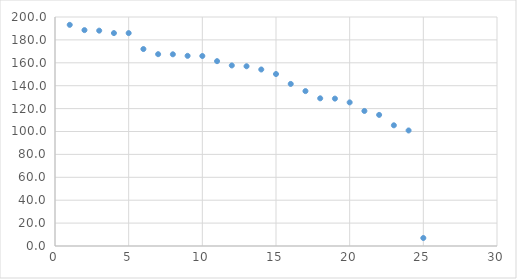
| Category | Series 0 |
|---|---|
| 1.0 | 193.147 |
| 2.0 | 188.543 |
| 3.0 | 188.076 |
| 4.0 | 185.95 |
| 5.0 | 185.946 |
| 6.0 | 172.017 |
| 7.0 | 167.535 |
| 8.0 | 167.427 |
| 9.0 | 166.084 |
| 10.0 | 165.944 |
| 11.0 | 161.437 |
| 12.0 | 157.687 |
| 13.0 | 156.984 |
| 14.0 | 154.154 |
| 15.0 | 150.188 |
| 16.0 | 141.552 |
| 17.0 | 135.287 |
| 18.0 | 128.979 |
| 19.0 | 128.714 |
| 20.0 | 125.42 |
| 21.0 | 117.94 |
| 22.0 | 114.501 |
| 23.0 | 105.413 |
| 24.0 | 100.9 |
| 25.0 | 6.987 |